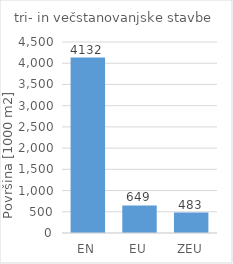
| Category | Series 0 |
|---|---|
| EN | 4132204.8 |
| EU | 648774.2 |
| ZEU | 482590.8 |